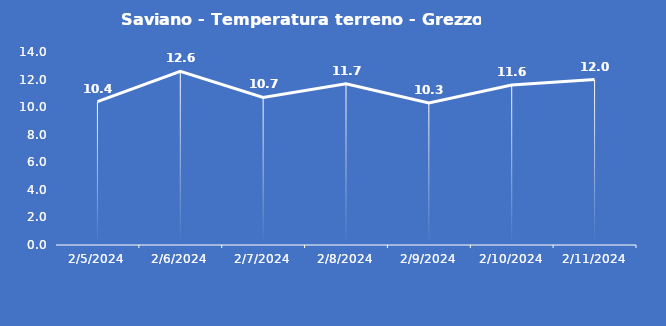
| Category | Saviano - Temperatura terreno - Grezzo (°C) |
|---|---|
| 2/5/24 | 10.4 |
| 2/6/24 | 12.6 |
| 2/7/24 | 10.7 |
| 2/8/24 | 11.7 |
| 2/9/24 | 10.3 |
| 2/10/24 | 11.6 |
| 2/11/24 | 12 |